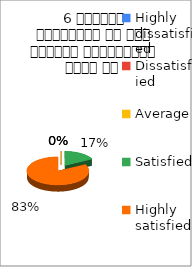
| Category | 6 शिक्षक समयनिष्ट है एवं नियमित व्याख्यान देते है  |
|---|---|
| Highly dissatisfied | 0 |
| Dissatisfied | 0 |
| Average | 0 |
| Satisfied | 5 |
| Highly satisfied | 24 |